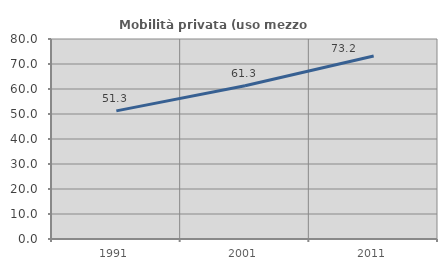
| Category | Mobilità privata (uso mezzo privato) |
|---|---|
| 1991.0 | 51.258 |
| 2001.0 | 61.306 |
| 2011.0 | 73.213 |